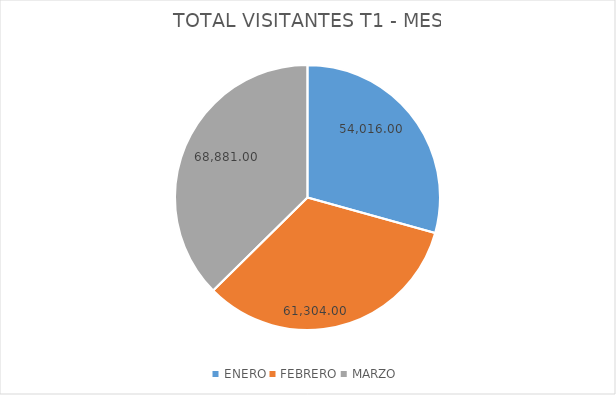
| Category | Suma de TOTAL VISITANTES |
|---|---|
| ENERO | 54016 |
| FEBRERO | 61304 |
| MARZO | 68881 |